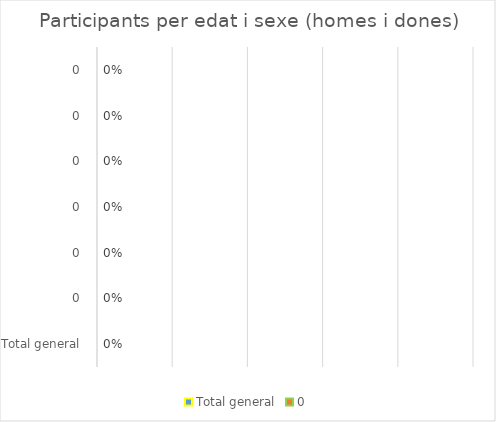
| Category | Total general | 0 |
|---|---|---|
| Total general | 0 | 0 |
| 0 | 0 | 0 |
| 0 | 0 | 0 |
| 0 | 0 | 0 |
| 0 | 0 | 0 |
| 0 | 0 | 0 |
| 0 | 0 | 0 |